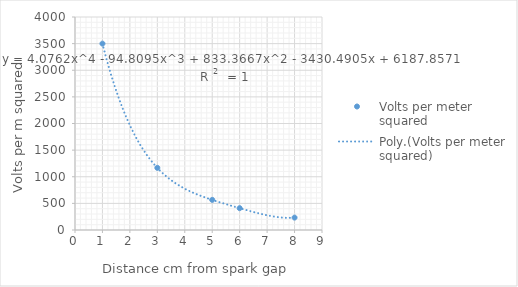
| Category | Volts per meter squared |
|---|---|
| 1.0 | 3500 |
| 3.0 | 1167 |
| 5.0 | 566 |
| 6.0 | 410 |
| 8.0 | 233 |